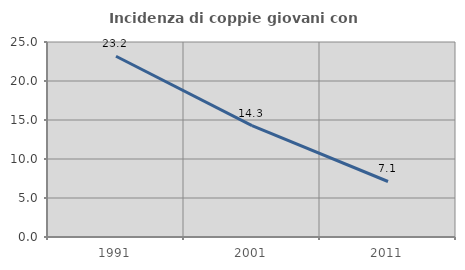
| Category | Incidenza di coppie giovani con figli |
|---|---|
| 1991.0 | 23.168 |
| 2001.0 | 14.282 |
| 2011.0 | 7.117 |